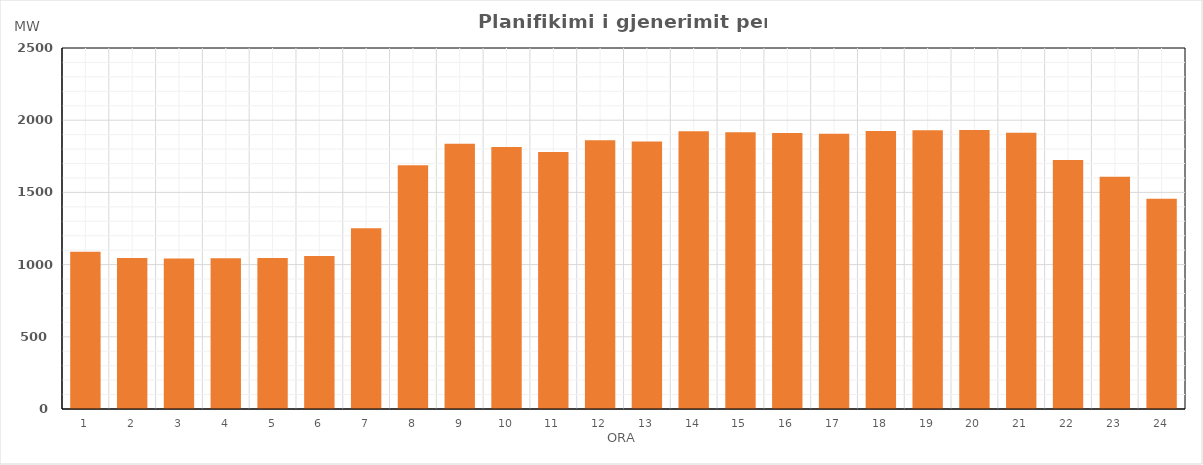
| Category | Max (MW) |
|---|---|
| 0 | 1089.52 |
| 1 | 1045.42 |
| 2 | 1043.03 |
| 3 | 1043.93 |
| 4 | 1045.71 |
| 5 | 1059.02 |
| 6 | 1251.03 |
| 7 | 1687.26 |
| 8 | 1837.46 |
| 9 | 1814.18 |
| 10 | 1779.15 |
| 11 | 1860.71 |
| 12 | 1851.87 |
| 13 | 1923.1 |
| 14 | 1916.5 |
| 15 | 1910.93 |
| 16 | 1905.84 |
| 17 | 1924.83 |
| 18 | 1929.94 |
| 19 | 1931.46 |
| 20 | 1913.26 |
| 21 | 1724.55 |
| 22 | 1608.39 |
| 23 | 1455.91 |